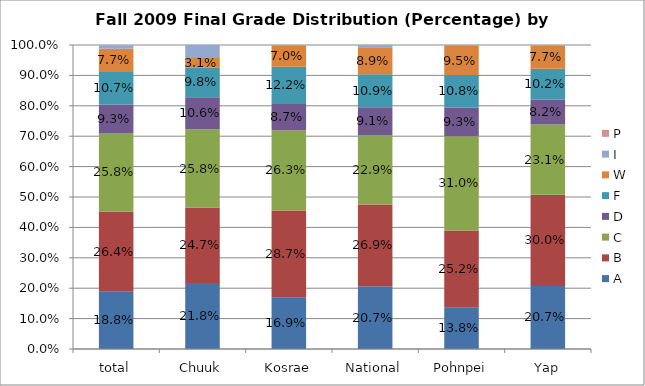
| Category | A | B | C | D | F  | W | I | P |
|---|---|---|---|---|---|---|---|---|
| total | 0.188 | 0.264 | 0.258 | 0.093 | 0.107 | 0.077 | 0.011 | 0.001 |
| Chuuk | 0.218 | 0.247 | 0.258 | 0.106 | 0.098 | 0.031 | 0.043 | 0 |
| Kosrae | 0.169 | 0.287 | 0.263 | 0.087 | 0.122 | 0.07 | 0.001 | 0 |
| National | 0.207 | 0.269 | 0.229 | 0.091 | 0.109 | 0.089 | 0.005 | 0.003 |
| Pohnpei | 0.138 | 0.252 | 0.31 | 0.093 | 0.108 | 0.095 | 0.004 | 0 |
| Yap | 0.207 | 0.3 | 0.231 | 0.082 | 0.102 | 0.077 | 0.001 | 0 |